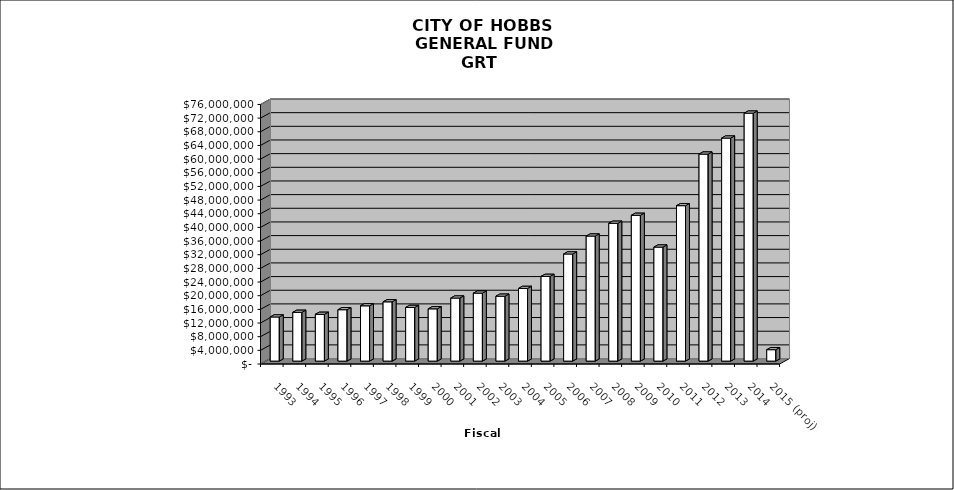
| Category | Series 0 |
|---|---|
| 1993 | 12921369 |
| 1994 | 14283507 |
| 1995 | 13696299 |
| 1996 | 15044957 |
| 1997 | 16188431 |
| 1998 | 17355281 |
| 1999 | 15710669 |
| 2000 | 15306944 |
| 2001 | 18464849 |
| 2002 | 19905159 |
| 2003 | 19000551 |
| 2004 | 21276720.726 |
| 2005 | 24807520.07 |
| 2006 | 31367768.501 |
| 2007 | 36612132.409 |
| 2008 | 40358387.166 |
| 2009 | 42688402.497 |
| 2010 | 33380270.668 |
| 2011 | 45507711.857 |
| 2012 | 60618813.725 |
| 2013 | 65310148.758 |
| 2014 | 72600731.593 |
| 2015 (proj) | 3342359.602 |